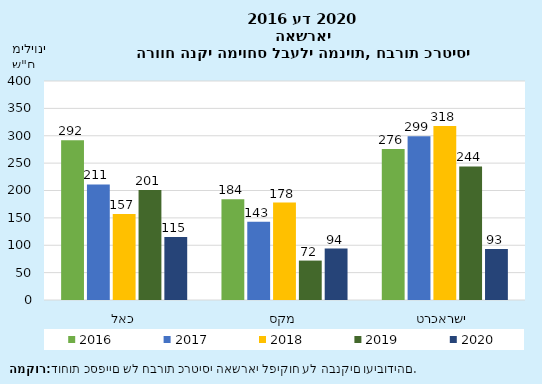
| Category | 2016 | 2017 | 2018 | 2019 | 2020 |
|---|---|---|---|---|---|
| כאל | 292 | 211 | 157 | 201 | 115 |
| מקס | 184 | 143 | 178 | 72 | 94 |
| ישראכרט | 276 | 299 | 318 | 244 | 93 |